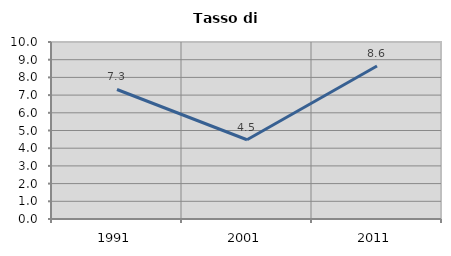
| Category | Tasso di disoccupazione   |
|---|---|
| 1991.0 | 7.317 |
| 2001.0 | 4.478 |
| 2011.0 | 8.646 |